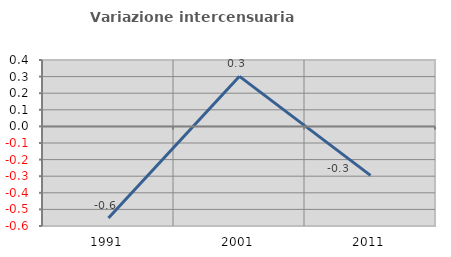
| Category | Variazione intercensuaria annua |
|---|---|
| 1991.0 | -0.552 |
| 2001.0 | 0.302 |
| 2011.0 | -0.295 |